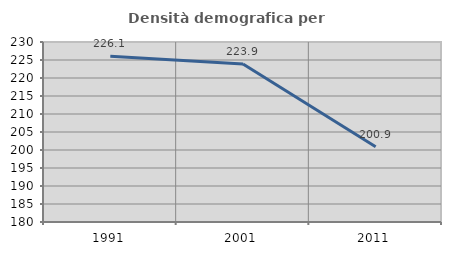
| Category | Densità demografica |
|---|---|
| 1991.0 | 226.072 |
| 2001.0 | 223.904 |
| 2011.0 | 200.897 |